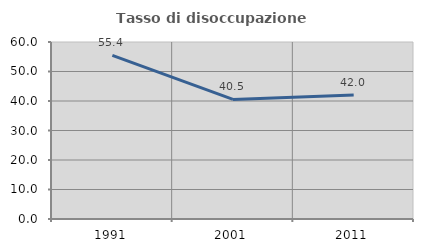
| Category | Tasso di disoccupazione giovanile  |
|---|---|
| 1991.0 | 55.444 |
| 2001.0 | 40.531 |
| 2011.0 | 42.004 |